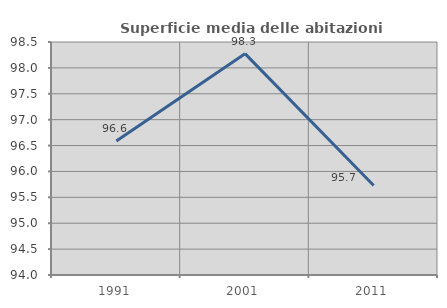
| Category | Superficie media delle abitazioni occupate |
|---|---|
| 1991.0 | 96.588 |
| 2001.0 | 98.275 |
| 2011.0 | 95.727 |